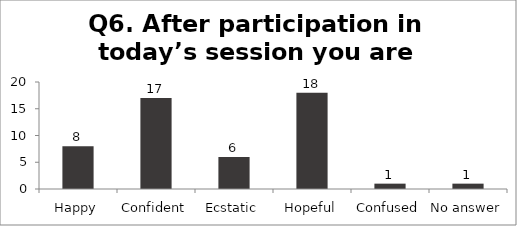
| Category | Q6. After participation in today’s session you are feeling? |
|---|---|
| Happy | 8 |
| Confident | 17 |
| Ecstatic | 6 |
| Hopeful | 18 |
| Confused | 1 |
| No answer | 1 |